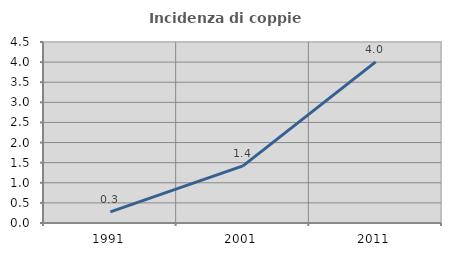
| Category | Incidenza di coppie miste |
|---|---|
| 1991.0 | 0.278 |
| 2001.0 | 1.42 |
| 2011.0 | 4.007 |